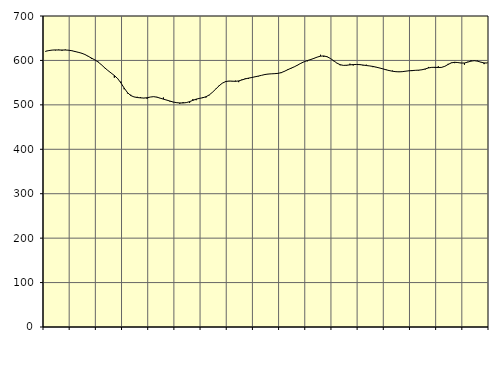
| Category | Piggar | Series 1 |
|---|---|---|
| nan | 619.7 | 620.73 |
| 87.0 | 622 | 622.19 |
| 87.0 | 623.1 | 623.29 |
| 87.0 | 622.6 | 623.64 |
| nan | 624.4 | 623.42 |
| 88.0 | 621.9 | 623.4 |
| 88.0 | 624.4 | 623.42 |
| 88.0 | 623.5 | 622.99 |
| nan | 621.2 | 621.82 |
| 89.0 | 621.1 | 620.06 |
| 89.0 | 618.9 | 618.25 |
| 89.0 | 615.7 | 616.25 |
| nan | 613.7 | 613.35 |
| 90.0 | 610.1 | 609.4 |
| 90.0 | 603.4 | 605.26 |
| 90.0 | 601.9 | 601.32 |
| nan | 597.5 | 596.67 |
| 91.0 | 590.2 | 590.57 |
| 91.0 | 582.8 | 583.75 |
| 91.0 | 577.6 | 577.49 |
| nan | 571.8 | 571.72 |
| 92.0 | 561.2 | 566.08 |
| 92.0 | 558.5 | 559.22 |
| 92.0 | 552.3 | 549.41 |
| nan | 535.1 | 537.87 |
| 93.0 | 525.8 | 527.65 |
| 93.0 | 522.8 | 521.03 |
| 93.0 | 517.8 | 517.9 |
| nan | 518.1 | 516.51 |
| 94.0 | 517.5 | 515.77 |
| 94.0 | 515 | 515.35 |
| 94.0 | 513.6 | 515.94 |
| nan | 517.7 | 517.61 |
| 95.0 | 518.2 | 518.44 |
| 95.0 | 517.9 | 517.31 |
| 95.0 | 514.7 | 515.1 |
| nan | 516.5 | 512.84 |
| 96.0 | 511.1 | 510.7 |
| 96.0 | 507.3 | 508.51 |
| 96.0 | 505.9 | 506.4 |
| nan | 505.5 | 504.96 |
| 97.0 | 502.5 | 504.31 |
| 97.0 | 506.3 | 504.22 |
| 97.0 | 505.6 | 505.11 |
| nan | 504.5 | 507.26 |
| 98.0 | 512.9 | 510.11 |
| 98.0 | 510.5 | 512.82 |
| 98.0 | 513.9 | 514.57 |
| nan | 517.4 | 515.97 |
| 99.0 | 516.4 | 518.27 |
| 99.0 | 521.7 | 522.31 |
| 99.0 | 528.7 | 528.45 |
| nan | 536.1 | 535.62 |
| 0.0 | 543.4 | 542.8 |
| 0.0 | 549 | 548.84 |
| 0.0 | 553.5 | 552.34 |
| nan | 553 | 553.6 |
| 1.0 | 552.7 | 553.36 |
| 1.0 | 554.5 | 552.91 |
| 1.0 | 551.1 | 553.88 |
| nan | 557.1 | 556.12 |
| 2.0 | 559.7 | 558.4 |
| 2.0 | 558.5 | 560.16 |
| 2.0 | 562.3 | 561.57 |
| nan | 563.5 | 563.15 |
| 3.0 | 564 | 564.79 |
| 3.0 | 566.4 | 566.49 |
| 3.0 | 569.2 | 568.23 |
| nan | 569.1 | 569.35 |
| 4.0 | 569.6 | 569.81 |
| 4.0 | 569.7 | 570.25 |
| 4.0 | 571.2 | 570.88 |
| nan | 571.5 | 572.53 |
| 5.0 | 576.1 | 575.57 |
| 5.0 | 580.2 | 579.14 |
| 5.0 | 581.8 | 582.49 |
| nan | 585.9 | 585.62 |
| 6.0 | 589 | 589.52 |
| 6.0 | 594 | 593.61 |
| 6.0 | 597.3 | 597.02 |
| nan | 598 | 599.76 |
| 7.0 | 603.1 | 602 |
| 7.0 | 605 | 604.65 |
| 7.0 | 607.3 | 607.48 |
| nan | 612.7 | 609.6 |
| 8.0 | 607.9 | 610.1 |
| 8.0 | 609 | 608.33 |
| 8.0 | 604.5 | 604.57 |
| nan | 598.3 | 599.48 |
| 9.0 | 593.8 | 594.14 |
| 9.0 | 589.2 | 590.41 |
| 9.0 | 589.1 | 588.85 |
| nan | 588.3 | 589.2 |
| 10.0 | 592.6 | 590.04 |
| 10.0 | 588.6 | 590.67 |
| 10.0 | 590.5 | 590.87 |
| nan | 591.9 | 590.52 |
| 11.0 | 588.7 | 589.64 |
| 11.0 | 590.4 | 588.52 |
| 11.0 | 587.4 | 587.61 |
| nan | 584.9 | 586.48 |
| 12.0 | 585.3 | 584.88 |
| 12.0 | 582.8 | 583.13 |
| 12.0 | 581.7 | 581.13 |
| nan | 580 | 579 |
| 13.0 | 576.2 | 577.2 |
| 13.0 | 577 | 575.68 |
| 13.0 | 575.6 | 574.67 |
| nan | 574.8 | 574.31 |
| 14.0 | 574.2 | 574.72 |
| 14.0 | 575.3 | 575.78 |
| 14.0 | 576.2 | 576.62 |
| nan | 576 | 577.22 |
| 15.0 | 578 | 577.72 |
| 15.0 | 577.2 | 578.13 |
| 15.0 | 578.7 | 578.93 |
| nan | 579.7 | 580.84 |
| 16.0 | 585.3 | 583.07 |
| 16.0 | 584.8 | 584.38 |
| 16.0 | 582.9 | 584.5 |
| nan | 586.8 | 583.99 |
| 17.0 | 583.8 | 584.35 |
| 17.0 | 586.5 | 586.79 |
| 17.0 | 592.3 | 590.91 |
| nan | 595.3 | 594.55 |
| 18.0 | 593.9 | 595.86 |
| 18.0 | 595.2 | 595.19 |
| 18.0 | 594.5 | 594.1 |
| nan | 590.4 | 594.22 |
| 19.0 | 597 | 596.15 |
| 19.0 | 600.2 | 598.46 |
| 19.0 | 599.9 | 599.37 |
| nan | 599.4 | 598.35 |
| 20.0 | 596.5 | 596.12 |
| 20.0 | 591.7 | 594.37 |
| 20.0 | 594.8 | 594.19 |